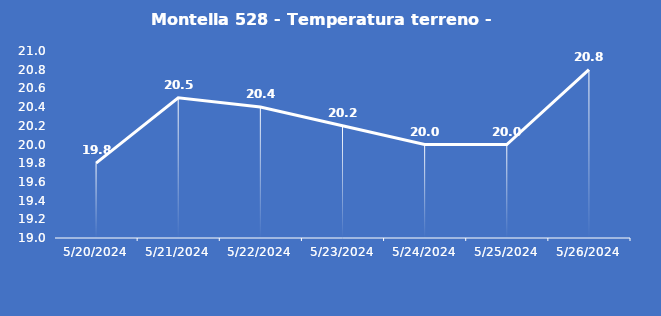
| Category | Montella 528 - Temperatura terreno - Grezzo (°C) |
|---|---|
| 5/20/24 | 19.8 |
| 5/21/24 | 20.5 |
| 5/22/24 | 20.4 |
| 5/23/24 | 20.2 |
| 5/24/24 | 20 |
| 5/25/24 | 20 |
| 5/26/24 | 20.8 |